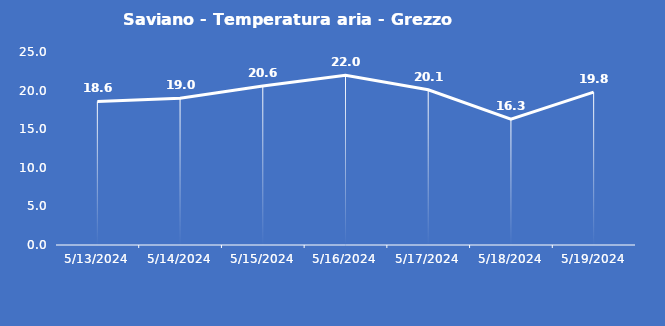
| Category | Saviano - Temperatura aria - Grezzo (°C) |
|---|---|
| 5/13/24 | 18.6 |
| 5/14/24 | 19 |
| 5/15/24 | 20.6 |
| 5/16/24 | 22 |
| 5/17/24 | 20.1 |
| 5/18/24 | 16.3 |
| 5/19/24 | 19.8 |